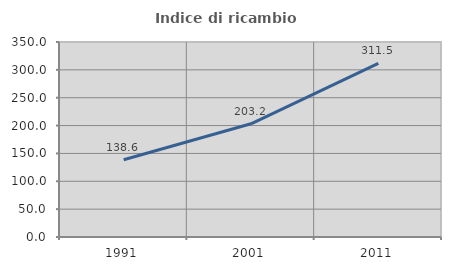
| Category | Indice di ricambio occupazionale  |
|---|---|
| 1991.0 | 138.636 |
| 2001.0 | 203.226 |
| 2011.0 | 311.538 |